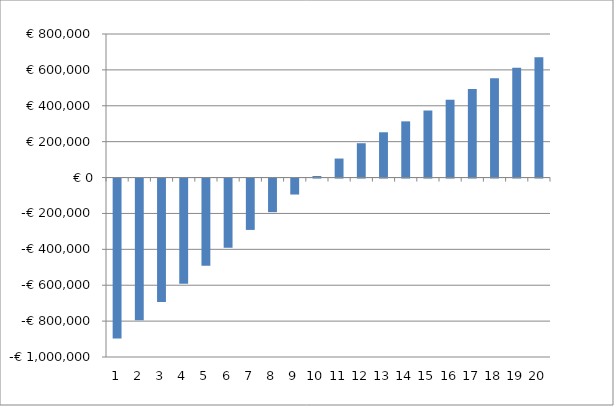
| Category | Series 0 |
|---|---|
| 0 | -82491.521 |
| 1 | -68355.198 |
| 2 | -54225.242 |
| 3 | -40099.538 |
| 4 | -25975.946 |
| 5 | -11852.307 |
| 6 | 2273.567 |
| 7 | 16403.883 |
| 8 | 30540.875 |
| 9 | 44686.802 |
| 10 | 58843.949 |
| 11 | 72133.384 |
| 12 | 84053.877 |
| 13 | 95992.609 |
| 14 | 107951.976 |
| 15 | 119934.404 |
| 16 | 131942.348 |
| 17 | 143978.297 |
| 18 | 156044.769 |
| 19 | 168144.318 |